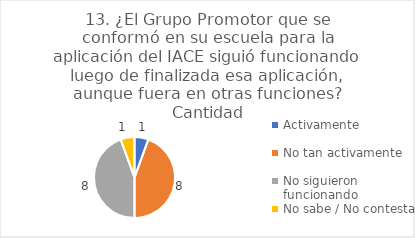
| Category | 13. ¿El Grupo Promotor que se conformó en su escuela para la aplicación del IACE siguió funcionando luego de finalizada esa aplicación, aunque fuera en otras funciones? |
|---|---|
| Activamente  | 0.056 |
| No tan activamente  | 0.444 |
| No siguieron funcionando  | 0.444 |
| No sabe / No contesta | 0.056 |